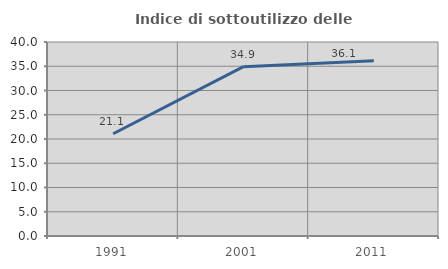
| Category | Indice di sottoutilizzo delle abitazioni  |
|---|---|
| 1991.0 | 21.078 |
| 2001.0 | 34.914 |
| 2011.0 | 36.131 |